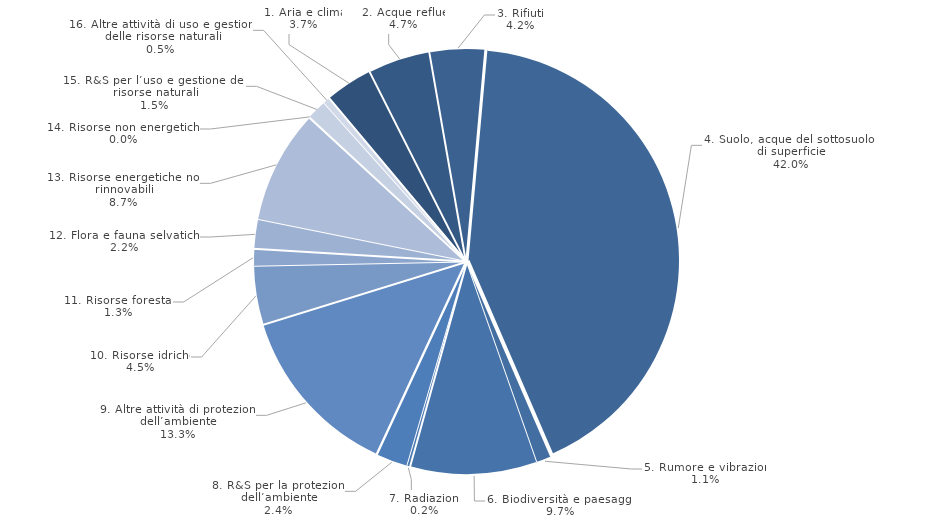
| Category | Series 0 |
|---|---|
| 1. Aria e clima | 0.037 |
| 2. Acque reflue | 0.047 |
| 3. Rifiuti | 0.042 |
| 4. Suolo, acque del sottosuolo e di superficie | 0.42 |
| 5. Rumore e vibrazioni | 0.011 |
| 6. Biodiversità e paesaggio | 0.097 |
| 7. Radiazioni | 0.002 |
| 8. R&S per la protezione dell’ambiente | 0.024 |
| 9. Altre attività di protezione dell’ambiente | 0.133 |
| 10. Risorse idriche | 0.045 |
| 11. Risorse forestali | 0.013 |
| 12. Flora e fauna selvatiche | 0.022 |
| 13. Risorse energetiche non rinnovabili | 0.087 |
| 14. Risorse non energetiche | 0 |
| 15. R&S per l’uso e gestione delle risorse naturali | 0.015 |
| 16. Altre attività di uso e gestione delle risorse naturali | 0.005 |